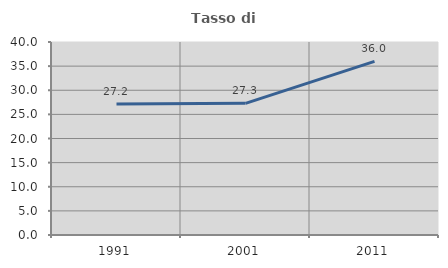
| Category | Tasso di occupazione   |
|---|---|
| 1991.0 | 27.165 |
| 2001.0 | 27.287 |
| 2011.0 | 35.979 |